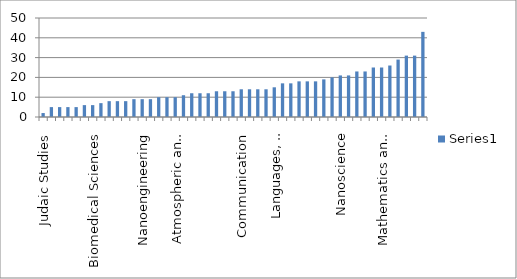
| Category | Series 0 |
|---|---|
| Judaic Studies | 2 |
| Theatre | 5 |
| Women's Studies | 5 |
| Nanoeconomics | 5 |
| Environmental Health Sciences | 5 |
| Marketing | 6 |
| Biomedical Sciences | 6 |
| Reading | 7 |
| Music | 8 |
| Information Studies | 8 |
| Finance | 8 |
| Africana Studies | 9 |
| Nanoengineering | 9 |
| Information Technology Management | 9 |
| East Asian Studies | 10 |
| Management | 10 |
| Health Policy, Management and Behavior | 10 |
| Informatics | 11 |
| Atmospheric and Environmental Sciences | 12 |
| Philosophy | 12 |
| Accounting and Law | 12 |
| Geography and Planning | 13 |
| Physics | 13 |
| Educational Administration & Policy Studies | 13 |
| Communication | 14 |
| Computer Science | 14 |
| Nanobioscience | 14 |
| Educational Theory and Practice | 14 |
| Art | 15 |
| Economics | 17 |
| Languages, Lteratures, & Cultures | 17 |
| Chemistry | 18 |
| Epidemiology and Biostatistics | 18 |
| Criminal Justice | 18 |
| Anthropology | 19 |
| Latin American, Caribbean, and U.S Latino Studies | 20 |
| Nanoscience | 21 |
| Public Administration and Policy | 21 |
| Political Science | 23 |
| School of Social Welfare | 23 |
| History | 25 |
| Sociology | 25 |
| Mathematics and Statistics | 26 |
| Educational & Counseling Psychology | 29 |
| Biological Sciences | 31 |
| Psychology | 31 |
| English | 43 |